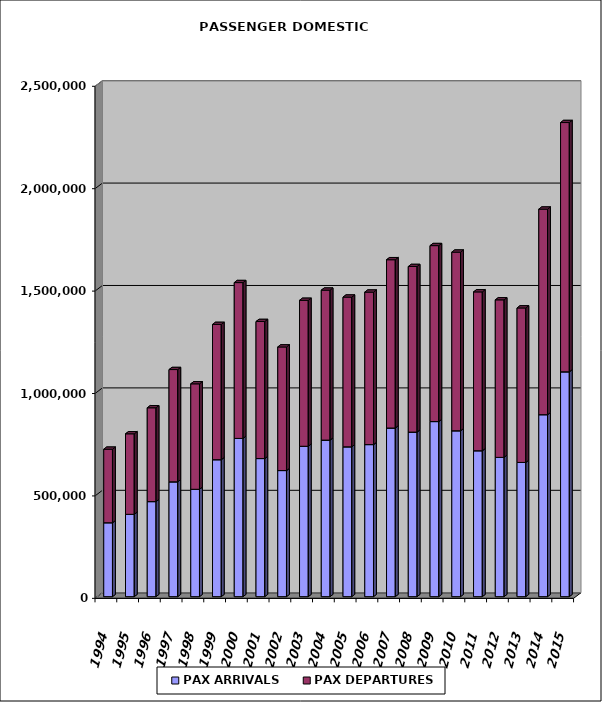
| Category | PAX ARRIVALS | PAX DEPARTURES |
|---|---|---|
| 1994.0 | 360883 | 358963 |
| 1995.0 | 401962 | 393123 |
| 1996.0 | 464067 | 458123 |
| 1997.0 | 560568 | 548168 |
| 1998.0 | 524232 | 514917 |
| 1999.0 | 668697 | 660279 |
| 2000.0 | 772548 | 760835 |
| 2001.0 | 674213 | 669153 |
| 2002.0 | 615650 | 603413 |
| 2003.0 | 734298 | 712379 |
| 2004.0 | 764369 | 732042 |
| 2005.0 | 731537 | 730968 |
| 2006.0 | 742424 | 744409 |
| 2007.0 | 823410 | 821540 |
| 2008.0 | 803444 | 808439 |
| 2009.0 | 854827 | 859063 |
| 2010.0 | 809869 | 872202 |
| 2011.0 | 712390 | 775582 |
| 2012.0 | 679977 | 769139 |
| 2013.0 | 655359 | 754249 |
| 2014.0 | 888459 | 1003559 |
| 2015.0 | 1097676 | 1217097 |